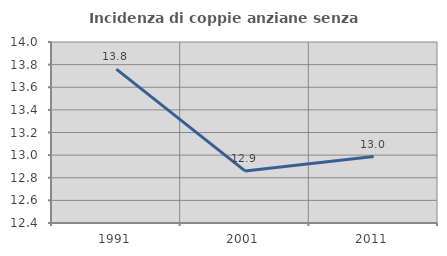
| Category | Incidenza di coppie anziane senza figli  |
|---|---|
| 1991.0 | 13.76 |
| 2001.0 | 12.86 |
| 2011.0 | 12.987 |